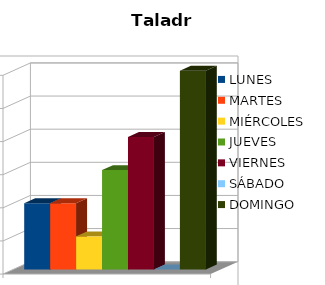
| Category | LUNES | MARTES | MIÉRCOLES | JUEVES | VIERNES | SÁBADO | DOMINGO |
|---|---|---|---|---|---|---|---|
| 0 | 2 | 2 | 1 | 3 | 4 | 0 | 6 |